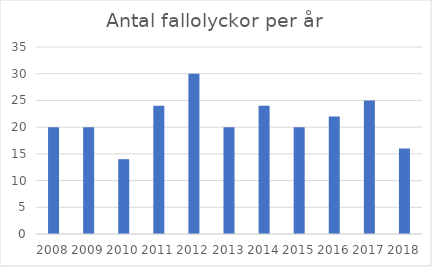
| Category | Antal fallolyckor |
|---|---|
| 2008.0 | 20 |
| 2009.0 | 20 |
| 2010.0 | 14 |
| 2011.0 | 24 |
| 2012.0 | 30 |
| 2013.0 | 20 |
| 2014.0 | 24 |
| 2015.0 | 20 |
| 2016.0 | 22 |
| 2017.0 | 25 |
| 2018.0 | 16 |